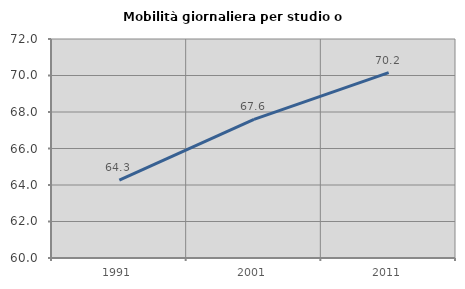
| Category | Mobilità giornaliera per studio o lavoro |
|---|---|
| 1991.0 | 64.265 |
| 2001.0 | 67.598 |
| 2011.0 | 70.156 |